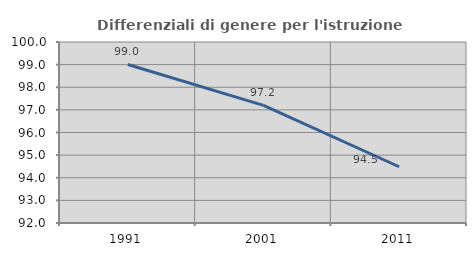
| Category | Differenziali di genere per l'istruzione superiore |
|---|---|
| 1991.0 | 99.008 |
| 2001.0 | 97.201 |
| 2011.0 | 94.486 |